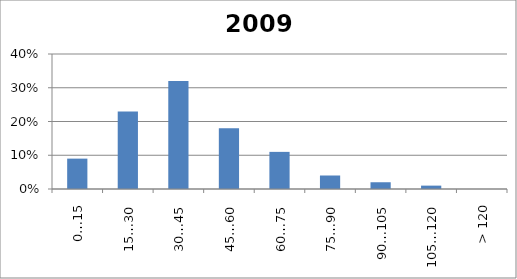
| Category | 2009 |
|---|---|
| 0…15 | 0.09 |
| 15…30 | 0.23 |
| 30…45 | 0.32 |
| 45…60 | 0.18 |
| 60…75 | 0.11 |
| 75…90 | 0.04 |
| 90…105 | 0.02 |
| 105…120 | 0.01 |
| > 120 | 0 |